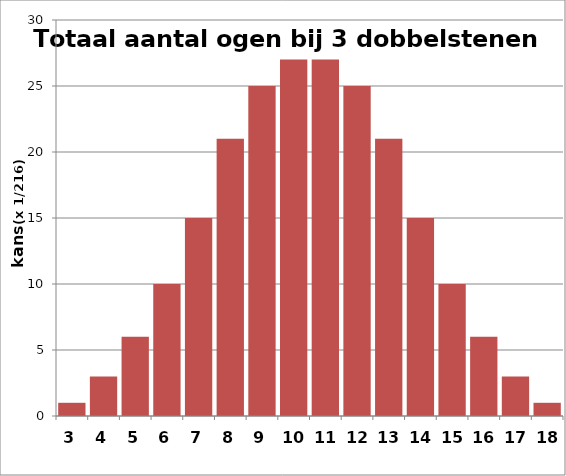
| Category | Series 1 |
|---|---|
| 3.0 | 1 |
| 4.0 | 3 |
| 5.0 | 6 |
| 6.0 | 10 |
| 7.0 | 15 |
| 8.0 | 21 |
| 9.0 | 25 |
| 10.0 | 27 |
| 11.0 | 27 |
| 12.0 | 25 |
| 13.0 | 21 |
| 14.0 | 15 |
| 15.0 | 10 |
| 16.0 | 6 |
| 17.0 | 3 |
| 18.0 | 1 |